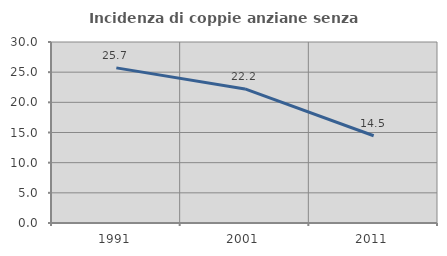
| Category | Incidenza di coppie anziane senza figli  |
|---|---|
| 1991.0 | 25.714 |
| 2001.0 | 22.222 |
| 2011.0 | 14.458 |